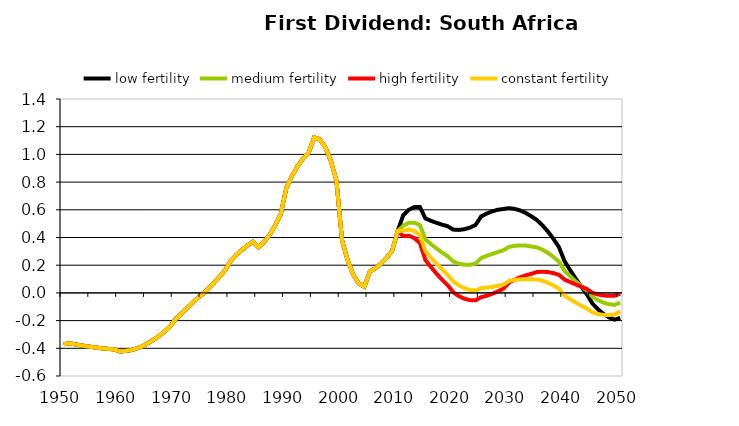
| Category | low fertility | medium fertility | high fertility | constant fertility |
|---|---|---|---|---|
| 1950.0 | -0.371 | -0.371 | -0.371 | -0.371 |
| 1951.0 | -0.363 | -0.363 | -0.363 | -0.363 |
| 1952.0 | -0.371 | -0.371 | -0.371 | -0.371 |
| 1953.0 | -0.378 | -0.378 | -0.378 | -0.378 |
| 1954.0 | -0.385 | -0.385 | -0.385 | -0.385 |
| 1955.0 | -0.391 | -0.391 | -0.391 | -0.391 |
| 1956.0 | -0.396 | -0.396 | -0.396 | -0.396 |
| 1957.0 | -0.4 | -0.4 | -0.4 | -0.4 |
| 1958.0 | -0.404 | -0.404 | -0.404 | -0.404 |
| 1959.0 | -0.408 | -0.408 | -0.408 | -0.408 |
| 1960.0 | -0.422 | -0.422 | -0.422 | -0.422 |
| 1961.0 | -0.42 | -0.42 | -0.42 | -0.42 |
| 1962.0 | -0.414 | -0.414 | -0.414 | -0.414 |
| 1963.0 | -0.403 | -0.403 | -0.403 | -0.403 |
| 1964.0 | -0.387 | -0.387 | -0.387 | -0.387 |
| 1965.0 | -0.366 | -0.366 | -0.366 | -0.366 |
| 1966.0 | -0.342 | -0.342 | -0.342 | -0.342 |
| 1967.0 | -0.314 | -0.314 | -0.314 | -0.314 |
| 1968.0 | -0.283 | -0.283 | -0.283 | -0.283 |
| 1969.0 | -0.247 | -0.247 | -0.247 | -0.247 |
| 1970.0 | -0.194 | -0.194 | -0.194 | -0.194 |
| 1971.0 | -0.155 | -0.155 | -0.155 | -0.155 |
| 1972.0 | -0.116 | -0.116 | -0.116 | -0.116 |
| 1973.0 | -0.078 | -0.078 | -0.078 | -0.078 |
| 1974.0 | -0.039 | -0.039 | -0.039 | -0.039 |
| 1975.0 | -0.008 | -0.008 | -0.008 | -0.008 |
| 1976.0 | 0.032 | 0.032 | 0.032 | 0.032 |
| 1977.0 | 0.074 | 0.074 | 0.074 | 0.074 |
| 1978.0 | 0.118 | 0.118 | 0.118 | 0.118 |
| 1979.0 | 0.163 | 0.163 | 0.163 | 0.163 |
| 1980.0 | 0.231 | 0.231 | 0.231 | 0.231 |
| 1981.0 | 0.274 | 0.274 | 0.274 | 0.274 |
| 1982.0 | 0.311 | 0.311 | 0.311 | 0.311 |
| 1983.0 | 0.343 | 0.343 | 0.343 | 0.343 |
| 1984.0 | 0.37 | 0.37 | 0.37 | 0.37 |
| 1985.0 | 0.33 | 0.33 | 0.33 | 0.33 |
| 1986.0 | 0.367 | 0.367 | 0.367 | 0.367 |
| 1987.0 | 0.42 | 0.42 | 0.42 | 0.42 |
| 1988.0 | 0.488 | 0.488 | 0.488 | 0.488 |
| 1989.0 | 0.571 | 0.571 | 0.571 | 0.571 |
| 1990.0 | 0.759 | 0.759 | 0.759 | 0.759 |
| 1991.0 | 0.843 | 0.843 | 0.843 | 0.843 |
| 1992.0 | 0.914 | 0.914 | 0.914 | 0.914 |
| 1993.0 | 0.97 | 0.97 | 0.97 | 0.97 |
| 1994.0 | 1.012 | 1.012 | 1.012 | 1.012 |
| 1995.0 | 1.124 | 1.124 | 1.124 | 1.124 |
| 1996.0 | 1.109 | 1.109 | 1.109 | 1.109 |
| 1997.0 | 1.052 | 1.052 | 1.052 | 1.052 |
| 1998.0 | 0.953 | 0.953 | 0.953 | 0.953 |
| 1999.0 | 0.811 | 0.811 | 0.811 | 0.811 |
| 2000.0 | 0.381 | 0.381 | 0.381 | 0.381 |
| 2001.0 | 0.237 | 0.237 | 0.237 | 0.237 |
| 2002.0 | 0.133 | 0.133 | 0.133 | 0.133 |
| 2003.0 | 0.069 | 0.069 | 0.069 | 0.069 |
| 2004.0 | 0.045 | 0.045 | 0.045 | 0.045 |
| 2005.0 | 0.154 | 0.154 | 0.154 | 0.154 |
| 2006.0 | 0.178 | 0.178 | 0.178 | 0.178 |
| 2007.0 | 0.211 | 0.211 | 0.211 | 0.211 |
| 2008.0 | 0.253 | 0.253 | 0.253 | 0.253 |
| 2009.0 | 0.303 | 0.303 | 0.303 | 0.303 |
| 2010.0 | 0.446 | 0.446 | 0.446 | 0.446 |
| 2011.0 | 0.561 | 0.485 | 0.41 | 0.448 |
| 2012.0 | 0.6 | 0.506 | 0.413 | 0.458 |
| 2013.0 | 0.62 | 0.507 | 0.396 | 0.448 |
| 2014.0 | 0.62 | 0.489 | 0.36 | 0.418 |
| 2015.0 | 0.538 | 0.386 | 0.237 | 0.3 |
| 2016.0 | 0.521 | 0.352 | 0.186 | 0.253 |
| 2017.0 | 0.506 | 0.32 | 0.138 | 0.21 |
| 2018.0 | 0.492 | 0.291 | 0.095 | 0.169 |
| 2019.0 | 0.481 | 0.265 | 0.055 | 0.131 |
| 2020.0 | 0.457 | 0.227 | 0.004 | 0.082 |
| 2021.0 | 0.455 | 0.211 | -0.023 | 0.055 |
| 2022.0 | 0.46 | 0.203 | -0.042 | 0.034 |
| 2023.0 | 0.471 | 0.203 | -0.052 | 0.021 |
| 2024.0 | 0.49 | 0.211 | -0.054 | 0.016 |
| 2025.0 | 0.552 | 0.252 | -0.031 | 0.034 |
| 2026.0 | 0.573 | 0.267 | -0.021 | 0.038 |
| 2027.0 | 0.589 | 0.281 | -0.007 | 0.043 |
| 2028.0 | 0.6 | 0.295 | 0.01 | 0.051 |
| 2029.0 | 0.606 | 0.308 | 0.031 | 0.06 |
| 2030.0 | 0.612 | 0.332 | 0.074 | 0.086 |
| 2031.0 | 0.607 | 0.34 | 0.095 | 0.094 |
| 2032.0 | 0.595 | 0.343 | 0.112 | 0.098 |
| 2033.0 | 0.578 | 0.341 | 0.126 | 0.099 |
| 2034.0 | 0.554 | 0.335 | 0.137 | 0.098 |
| 2035.0 | 0.527 | 0.329 | 0.151 | 0.097 |
| 2036.0 | 0.489 | 0.312 | 0.153 | 0.088 |
| 2037.0 | 0.443 | 0.289 | 0.151 | 0.073 |
| 2038.0 | 0.39 | 0.26 | 0.143 | 0.054 |
| 2039.0 | 0.33 | 0.225 | 0.13 | 0.03 |
| 2040.0 | 0.229 | 0.16 | 0.096 | -0.019 |
| 2041.0 | 0.164 | 0.12 | 0.079 | -0.046 |
| 2042.0 | 0.103 | 0.083 | 0.061 | -0.07 |
| 2043.0 | 0.045 | 0.049 | 0.045 | -0.092 |
| 2044.0 | -0.009 | 0.016 | 0.028 | -0.112 |
| 2045.0 | -0.076 | -0.028 | 0 | -0.141 |
| 2046.0 | -0.118 | -0.053 | -0.011 | -0.153 |
| 2047.0 | -0.152 | -0.07 | -0.019 | -0.159 |
| 2048.0 | -0.177 | -0.082 | -0.022 | -0.16 |
| 2049.0 | -0.193 | -0.086 | -0.02 | -0.155 |
| 2050.0 | -0.18 | -0.07 | -0.006 | -0.133 |